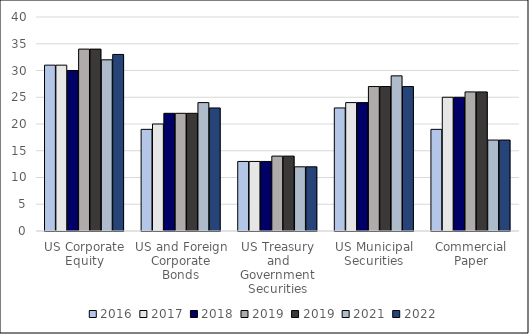
| Category | 2016 | 2017 | 2018 | 2019 | 2021 | 2022 |
|---|---|---|---|---|---|---|
| US Corporate Equity | 31 | 31 | 30 | 34 | 32 | 33 |
| US and Foreign Corporate Bonds | 19 | 20 | 22 | 22 | 24 | 23 |
| US Treasury and Government Securities | 13 | 13 | 13 | 14 | 12 | 12 |
| US Municipal Securities | 23 | 24 | 24 | 27 | 29 | 27 |
| Commercial Paper | 19 | 25 | 25 | 26 | 17 | 17 |